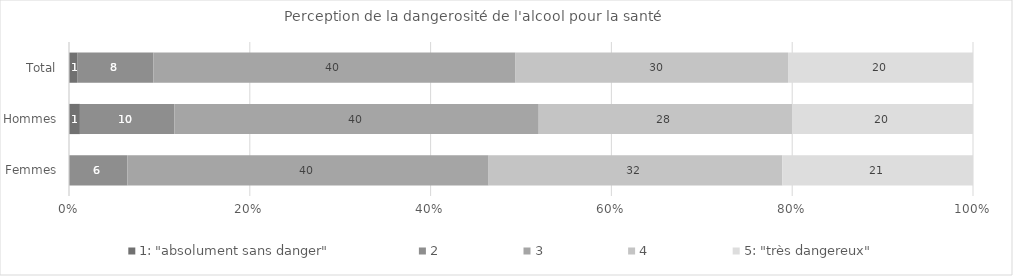
| Category | 1: "absolument sans danger" | 2 | 3 | 4 | 5: "très dangereux" |
|---|---|---|---|---|---|
| Total | 0.9 | 8.4 | 39.9 | 30.1 | 20.4 |
| Hommes | 1.2 | 10.4 | 40.1 | 27.9 | 19.9 |
| Femmes | 0 | 6.4 | 39.6 | 32.2 | 20.9 |